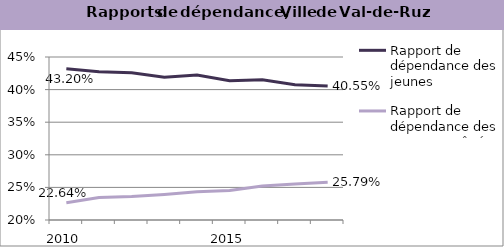
| Category | Rapport de dépendance des jeunes | Rapport de dépendance des personnes âgées |
|---|---|---|
| 2010.0 | 0.432 | 0.226 |
| 2011.0 | 0.428 | 0.234 |
| 2012.0 | 0.426 | 0.236 |
| 2013.0 | 0.419 | 0.239 |
| 2014.0 | 0.422 | 0.243 |
| 2015.0 | 0.413 | 0.245 |
| 2016.0 | 0.415 | 0.252 |
| 2017.0 | 0.408 | 0.255 |
| 2018.0 | 0.406 | 0.258 |